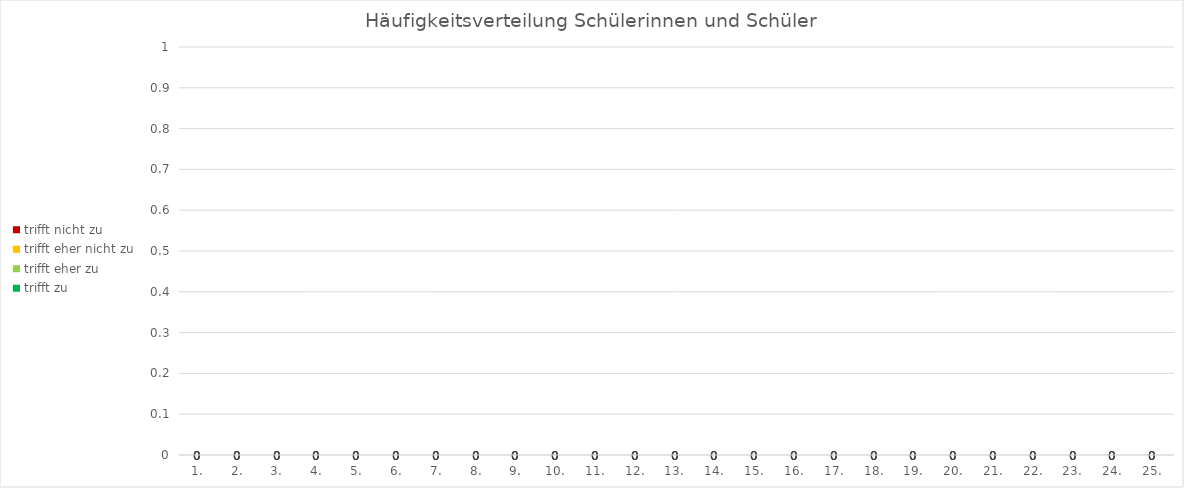
| Category | trifft zu | trifft eher zu | trifft eher nicht zu | trifft nicht zu |
|---|---|---|---|---|
| 1. | 0 | 0 | 0 | 0 |
| 2. | 0 | 0 | 0 | 0 |
| 3. | 0 | 0 | 0 | 0 |
| 4. | 0 | 0 | 0 | 0 |
| 5. | 0 | 0 | 0 | 0 |
| 6. | 0 | 0 | 0 | 0 |
| 7. | 0 | 0 | 0 | 0 |
| 8. | 0 | 0 | 0 | 0 |
| 9. | 0 | 0 | 0 | 0 |
| 10. | 0 | 0 | 0 | 0 |
| 11. | 0 | 0 | 0 | 0 |
| 12. | 0 | 0 | 0 | 0 |
| 13. | 0 | 0 | 0 | 0 |
| 14. | 0 | 0 | 0 | 0 |
| 15. | 0 | 0 | 0 | 0 |
| 16. | 0 | 0 | 0 | 0 |
| 17. | 0 | 0 | 0 | 0 |
| 18. | 0 | 0 | 0 | 0 |
| 19. | 0 | 0 | 0 | 0 |
| 20. | 0 | 0 | 0 | 0 |
| 21. | 0 | 0 | 0 | 0 |
| 22. | 0 | 0 | 0 | 0 |
| 23. | 0 | 0 | 0 | 0 |
| 24. | 0 | 0 | 0 | 0 |
| 25. | 0 | 0 | 0 | 0 |